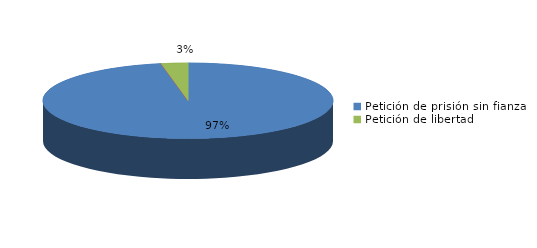
| Category | Series 0 |
|---|---|
| Petición de prisión sin fianza | 65 |
| Peticion de libertad con fianza | 0 |
| Petición de libertad | 2 |